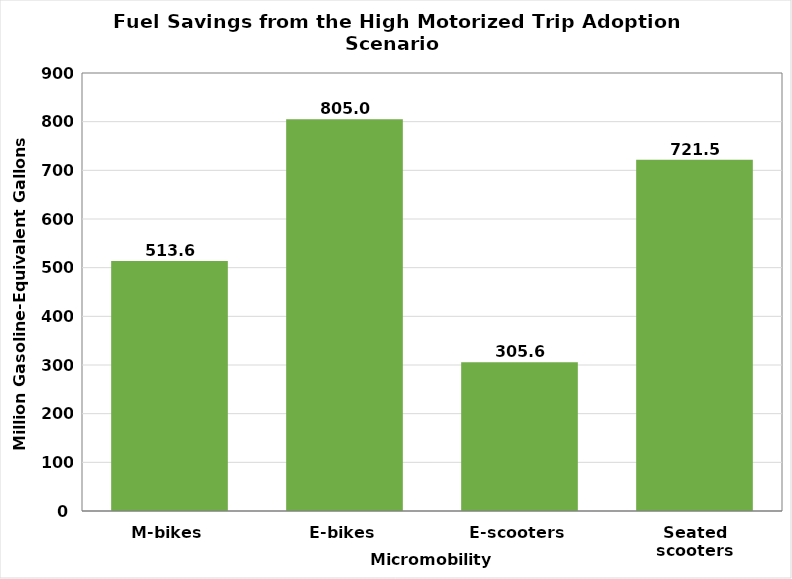
| Category | Series 0 |
|---|---|
| M-bikes | 513.6 |
| E-bikes | 805 |
| E-scooters | 305.6 |
| Seated scooters | 721.5 |